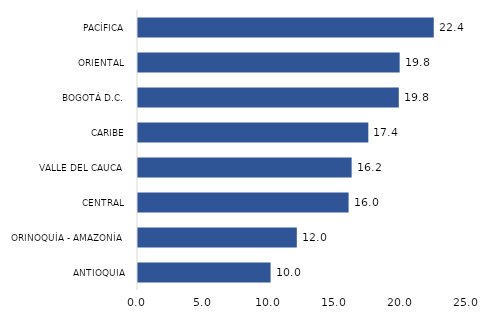
| Category | Series 0 |
|---|---|
| ANTIOQUIA | 10.046 |
| ORINOQUÍA - AMAZONÍA | 12.031 |
| CENTRAL | 15.954 |
| VALLE DEL CAUCA | 16.184 |
| CARIBE | 17.449 |
| BOGOTÁ D.C. | 19.758 |
| ORIENTAL | 19.822 |
| PACÍFICA | 22.406 |